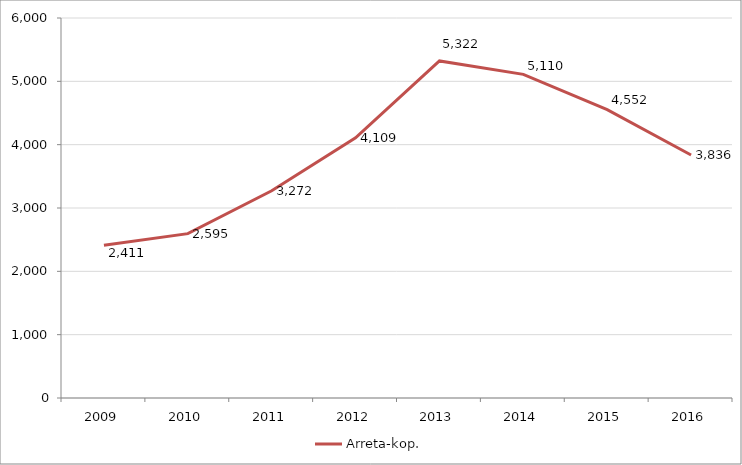
| Category | Arreta-kop. |
|---|---|
| 2009.0 | 2411 |
| 2010.0 | 2595 |
| 2011.0 | 3272 |
| 2012.0 | 4109 |
| 2013.0 | 5322 |
| 2014.0 | 5110 |
| 2015.0 | 4552 |
| 2016.0 | 3836 |